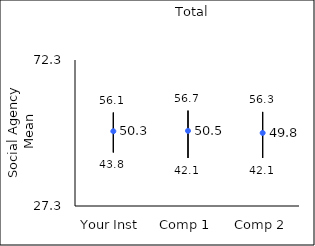
| Category | 25th percentile | 75th percentile | Mean |
|---|---|---|---|
| Your Inst | 43.8 | 56.1 | 50.34 |
| Comp 1 | 42.1 | 56.7 | 50.46 |
| Comp 2 | 42.1 | 56.3 | 49.82 |